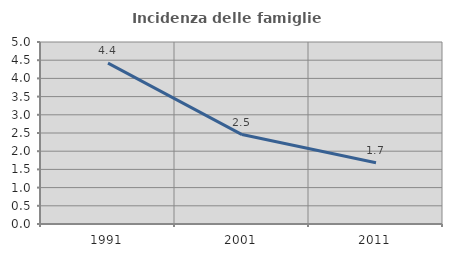
| Category | Incidenza delle famiglie numerose |
|---|---|
| 1991.0 | 4.418 |
| 2001.0 | 2.457 |
| 2011.0 | 1.682 |